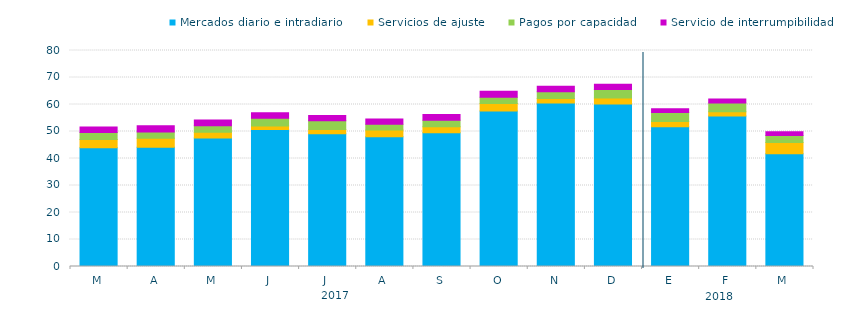
| Category | Mercados diario e intradiario  | Servicios de ajuste | Pagos por capacidad | Servicio de interrumpibilidad |
|---|---|---|---|---|
| M | 43.94 | 3.13 | 2.52 | 2.06 |
| A | 44.2 | 3.28 | 2.38 | 2.28 |
| M | 47.6 | 2.13 | 2.37 | 2.15 |
| J | 50.77 | 1.25 | 2.91 | 2 |
| J | 49.13 | 1.65 | 3.22 | 1.93 |
| A | 48.03 | 2.49 | 2.16 | 1.99 |
| S | 49.52 | 2.2 | 2.41 | 2.14 |
| O | 57.59 | 2.78 | 2.34 | 2.16 |
| N | 60.56 | 1.68 | 2.49 | 2.07 |
| D | 60.16 | 2.24 | 3.15 | 1.96 |
| E | 51.77 | 1.95 | 3.3 | 1.38 |
| F | 55.76 | 1.57 | 3.25 | 1.46 |
| M | 41.75 | 4.21 | 2.56 | 1.41 |